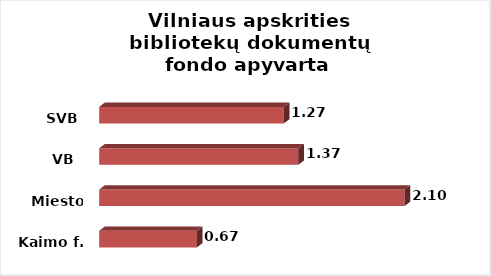
| Category | Series 0 |
|---|---|
| Kaimo f. | 0.672 |
| Miesto f. | 2.1 |
| VB  | 1.37 |
| SVB | 1.27 |